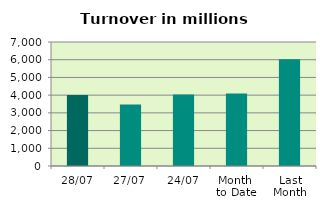
| Category | Series 0 |
|---|---|
| 28/07 | 4009.785 |
| 27/07 | 3477.854 |
| 24/07 | 4039.445 |
| Month 
to Date | 4096.349 |
| Last
Month | 6026.772 |